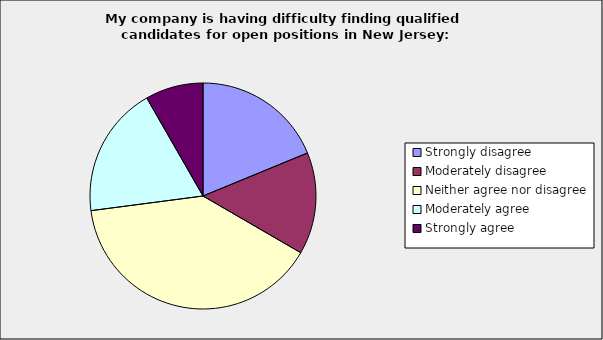
| Category | Series 0 |
|---|---|
| Strongly disagree | 0.188 |
| Moderately disagree | 0.146 |
| Neither agree nor disagree | 0.396 |
| Moderately agree | 0.188 |
| Strongly agree | 0.083 |